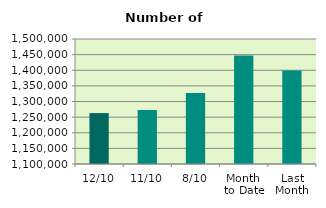
| Category | Series 0 |
|---|---|
| 12/10 | 1262968 |
| 11/10 | 1272782 |
| 8/10 | 1327220 |
| Month 
to Date | 1447166 |
| Last
Month | 1399299.909 |